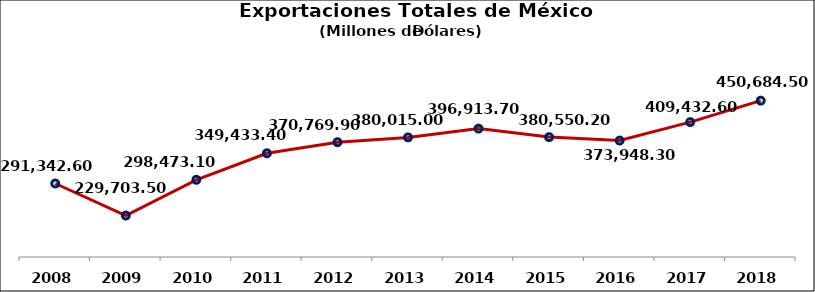
| Category | Exportaciones Totales de México (Millones USD) |
|---|---|
| 2008 | 291342.6 |
| 2009 | 229703.5 |
| 2010 | 298473.1 |
| 2011 | 349433.4 |
| 2012 | 370769.9 |
| 2013 | 380015 |
| 2014 | 396913.7 |
| 2015 | 380550.2 |
| 2016 | 373948.3 |
| 2017 | 409432.6 |
| 2018 | 450684.5 |